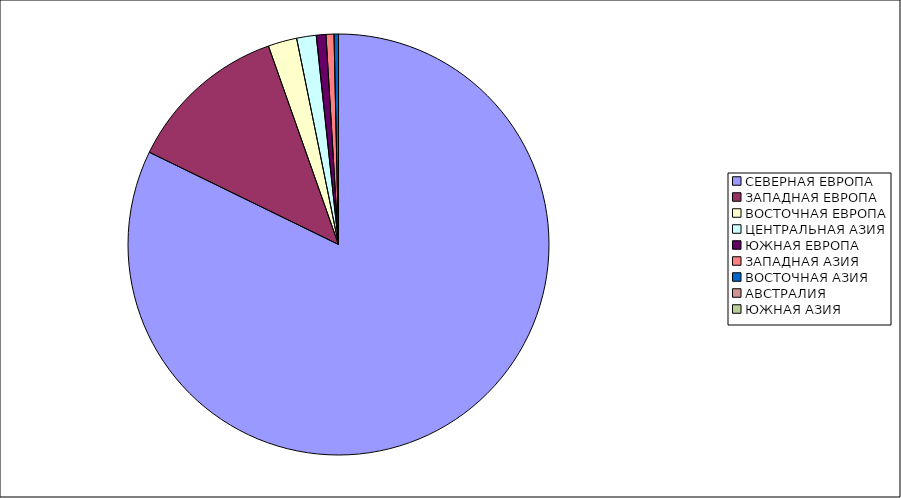
| Category | Оборот |
|---|---|
| СЕВЕРНАЯ ЕВРОПА | 82.22 |
| ЗАПАДНАЯ ЕВРОПА | 12.38 |
| ВОСТОЧНАЯ ЕВРОПА | 2.21 |
| ЦЕНТРАЛЬНАЯ АЗИЯ | 1.5 |
| ЮЖНАЯ ЕВРОПА | 0.74 |
| ЗАПАДНАЯ АЗИЯ | 0.61 |
| ВОСТОЧНАЯ АЗИЯ | 0.34 |
| АВСТРАЛИЯ | 0 |
| ЮЖНАЯ АЗИЯ | 0 |